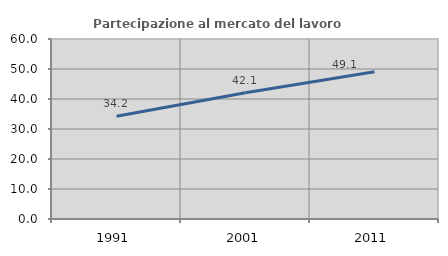
| Category | Partecipazione al mercato del lavoro  femminile |
|---|---|
| 1991.0 | 34.221 |
| 2001.0 | 42.105 |
| 2011.0 | 49.077 |